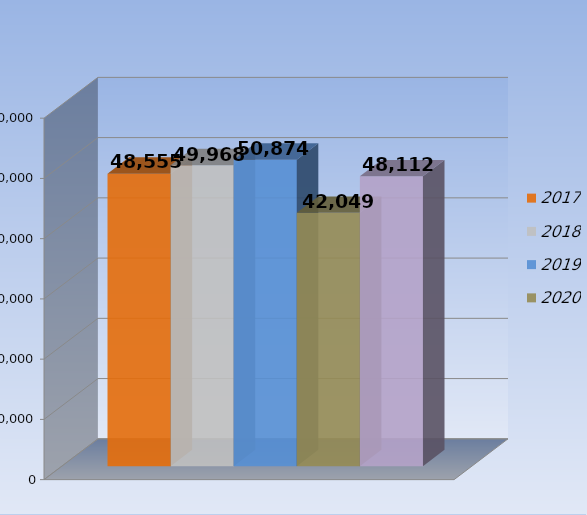
| Category | 2017 | 2018 | 2019 | 2020 | 2021 |
|---|---|---|---|---|---|
| 0 | 48555 | 49968 | 50874 | 42049 | 48112 |